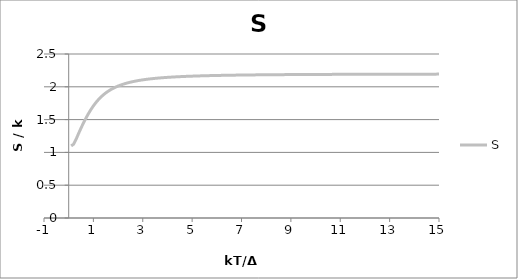
| Category | S |
|---|---|
| 0.1 | 1.099 |
| 0.2 | 1.125 |
| 0.3 | 1.2 |
| 0.4 | 1.287 |
| 0.5 | 1.371 |
| 0.6 | 1.45 |
| 0.7 | 1.523 |
| 0.8 | 1.591 |
| 0.9 | 1.653 |
| 1.0 | 1.709 |
| 1.1 | 1.758 |
| 1.2 | 1.803 |
| 1.3 | 1.842 |
| 1.4 | 1.876 |
| 1.5 | 1.906 |
| 1.6 | 1.933 |
| 1.7 | 1.956 |
| 1.8 | 1.977 |
| 1.9 | 1.995 |
| 2.0 | 2.011 |
| 2.1 | 2.026 |
| 2.2 | 2.039 |
| 2.3 | 2.051 |
| 2.4 | 2.061 |
| 2.5 | 2.07 |
| 2.6 | 2.079 |
| 2.7 | 2.087 |
| 2.8 | 2.094 |
| 2.9 | 2.1 |
| 3.0 | 2.106 |
| 3.1 | 2.111 |
| 3.2 | 2.116 |
| 3.3 | 2.121 |
| 3.4 | 2.125 |
| 3.5 | 2.129 |
| 3.6 | 2.132 |
| 3.7 | 2.135 |
| 3.8 | 2.138 |
| 3.9 | 2.141 |
| 4.0 | 2.144 |
| 4.1 | 2.146 |
| 4.2 | 2.149 |
| 4.3 | 2.151 |
| 4.4 | 2.153 |
| 4.5 | 2.155 |
| 4.6 | 2.156 |
| 4.7 | 2.158 |
| 4.8 | 2.16 |
| 4.9 | 2.161 |
| 5.0 | 2.162 |
| 5.1 | 2.164 |
| 5.2 | 2.165 |
| 5.3 | 2.166 |
| 5.4 | 2.167 |
| 5.5 | 2.168 |
| 5.6 | 2.169 |
| 5.7 | 2.17 |
| 5.8 | 2.171 |
| 5.9 | 2.172 |
| 6.0 | 2.173 |
| 6.1 | 2.174 |
| 6.2 | 2.174 |
| 6.3 | 2.175 |
| 6.4 | 2.176 |
| 6.5 | 2.176 |
| 6.6 | 2.177 |
| 6.7 | 2.178 |
| 6.8 | 2.178 |
| 6.9 | 2.179 |
| 7.0 | 2.179 |
| 7.1 | 2.18 |
| 7.2 | 2.18 |
| 7.3 | 2.181 |
| 7.4 | 2.181 |
| 7.5 | 2.181 |
| 7.6 | 2.182 |
| 7.7 | 2.182 |
| 7.8 | 2.183 |
| 7.9 | 2.183 |
| 8.0 | 2.183 |
| 8.1 | 2.184 |
| 8.2 | 2.184 |
| 8.3 | 2.184 |
| 8.4 | 2.185 |
| 8.5 | 2.185 |
| 8.6 | 2.185 |
| 8.7 | 2.185 |
| 8.8 | 2.186 |
| 8.9 | 2.186 |
| 9.0 | 2.186 |
| 9.1 | 2.186 |
| 9.2 | 2.187 |
| 9.3 | 2.187 |
| 9.4 | 2.187 |
| 9.5 | 2.187 |
| 9.6 | 2.188 |
| 9.7 | 2.188 |
| 9.8 | 2.188 |
| 9.9 | 2.188 |
| 10.0 | 2.188 |
| 10.1 | 2.188 |
| 10.2 | 2.189 |
| 10.3 | 2.189 |
| 10.4 | 2.189 |
| 10.5 | 2.189 |
| 10.6 | 2.189 |
| 10.7 | 2.189 |
| 10.8 | 2.19 |
| 10.9 | 2.19 |
| 11.0 | 2.19 |
| 11.1 | 2.19 |
| 11.2 | 2.19 |
| 11.3 | 2.19 |
| 11.4 | 2.19 |
| 11.5 | 2.19 |
| 11.6 | 2.191 |
| 11.7 | 2.191 |
| 11.8 | 2.191 |
| 11.9 | 2.191 |
| 12.0 | 2.191 |
| 12.1 | 2.191 |
| 12.2 | 2.191 |
| 12.3 | 2.191 |
| 12.4 | 2.191 |
| 12.5 | 2.191 |
| 12.6 | 2.192 |
| 12.7 | 2.192 |
| 12.8 | 2.192 |
| 12.9 | 2.192 |
| 13.0 | 2.192 |
| 13.1 | 2.192 |
| 13.2 | 2.192 |
| 13.3 | 2.192 |
| 13.4 | 2.192 |
| 13.5 | 2.192 |
| 13.6 | 2.192 |
| 13.7 | 2.192 |
| 13.8 | 2.193 |
| 13.9 | 2.193 |
| 14.0 | 2.193 |
| 14.1 | 2.193 |
| 14.2 | 2.193 |
| 14.3 | 2.193 |
| 14.4 | 2.193 |
| 14.5 | 2.193 |
| 14.6 | 2.193 |
| 14.7 | 2.193 |
| 14.8 | 2.193 |
| 14.9 | 2.193 |
| 15.0 | 2.193 |